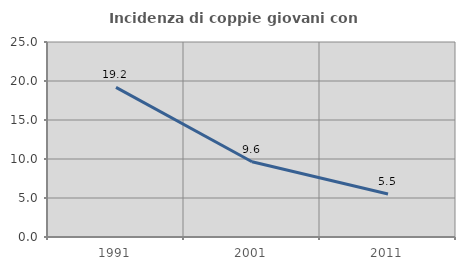
| Category | Incidenza di coppie giovani con figli |
|---|---|
| 1991.0 | 19.185 |
| 2001.0 | 9.642 |
| 2011.0 | 5.505 |